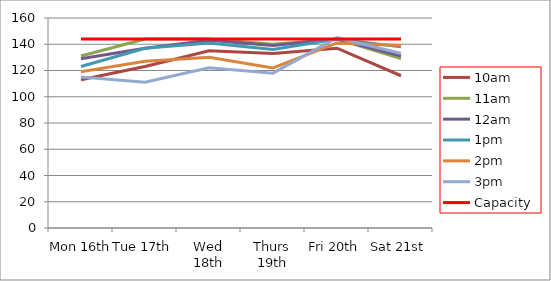
| Category | 9am | 10am | 11am | 12am | 1pm | 2pm | 3pm | 4pm | 5pm | Capacity |
|---|---|---|---|---|---|---|---|---|---|---|
| Mon 16th |  | 113 | 131 | 129 | 123 | 119 | 115 |  |  | 144 |
| Tue 17th |  | 123 | 144 | 137 | 137 | 127 | 111 |  |  | 144 |
| Wed 18th |  | 135 | 144 | 143 | 141 | 130 | 122 |  |  | 144 |
| Thurs 19th |  | 133 | 140 | 139 | 136 | 122 | 118 |  |  | 144 |
| Fri 20th |  | 137 | 144 | 144 | 144 | 141 | 145 |  |  | 144 |
| Sat 21st |  | 116 | 129 | 131 | 138 | 139 | 133 |  |  | 144 |